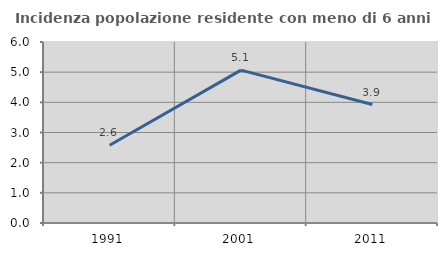
| Category | Incidenza popolazione residente con meno di 6 anni |
|---|---|
| 1991.0 | 2.577 |
| 2001.0 | 5.067 |
| 2011.0 | 3.927 |